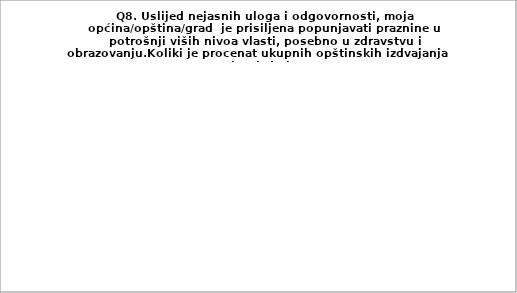
| Category | Series 0 |
|---|---|
| Do 3% izdvajanja | 29.31 |
| Do 5% izdvajanja | 25.862 |
| Do 10% izdvajanja | 22.414 |
| Do 15% izdvajanja | 5.172 |
| Najmanje 20% izdvajanja | 12.069 |
| Moja općina/opština grad nema takvih izdavanja | 5.172 |